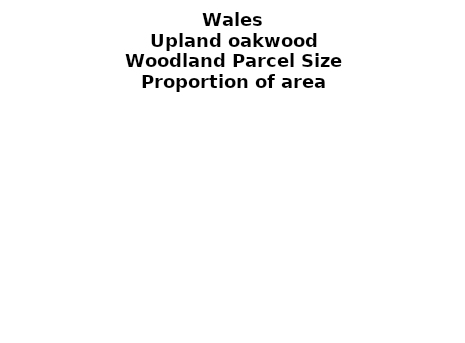
| Category | Upland oakwood |
|---|---|
| <5 ha | 0.174 |
| ≥5 and <10 ha | 0.122 |
| ≥10 and <15 ha | 0.038 |
| ≥15 and <20 ha | 0.061 |
| ≥20 and <25 ha | 0.047 |
| ≥25 and <30 ha | 0.033 |
| ≥30 and <35 ha | 0.015 |
| ≥35 and <40 ha | 0.017 |
| ≥40 and <45 ha | 0.025 |
| ≥45 and <50 ha | 0.014 |
| ≥50 and <60 ha | 0.039 |
| ≥60 and <70 ha | 0.009 |
| ≥70 and <80 ha | 0.009 |
| ≥80 and <90 ha | 0.015 |
| ≥90 and <100 ha | 0.021 |
| ≥100 and <150 ha | 0.07 |
| ≥150 and <200 ha | 0.039 |
| ≥200 ha | 0.251 |